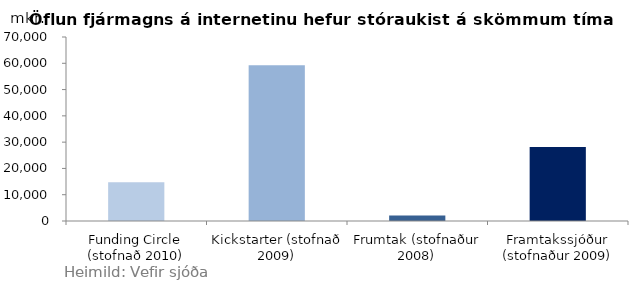
| Category | Series 0 |
|---|---|
| Funding Circle (stofnað 2010) | 14746.133 |
| Kickstarter (stofnað 2009) | 59250 |
| Frumtak (stofnaður 2008) | 2100 |
| Framtakssjóður (stofnaður 2009) | 28152.603 |